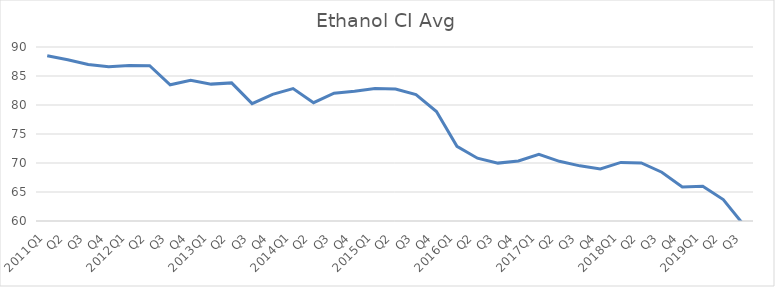
| Category | Series 0 |
|---|---|
| 2011Q1 | 88.48 |
| Q2 | 87.8 |
| Q3 | 87 |
| Q4 | 86.6 |
| 2012Q1 | 86.8 |
| Q2 | 86.78 |
| Q3 | 83.48 |
| Q4 | 84.27 |
| 2013Q1 | 83.6 |
| Q2 | 83.81 |
| Q3 | 80.24 |
| Q4 | 81.84 |
| 2014Q1 | 82.83 |
| Q2 | 80.4 |
| Q3 | 82.03 |
| Q4 | 82.38 |
| 2015Q1 | 82.86 |
| Q2 | 82.75 |
| Q3 | 81.8 |
| Q4 | 78.87 |
| 2016Q1 | 72.87 |
| Q2 | 70.83 |
| Q3 | 69.98 |
| Q4 | 70.34 |
| 2017Q1 | 71.49 |
| Q2 | 70.29 |
| Q3 | 69.51 |
| Q4 | 68.98 |
| 2018Q1 | 70.1 |
| Q2 | 70.02 |
| Q3 | 68.41 |
| Q4 | 65.88 |
| 2019Q1 | 66.01 |
| Q2 | 63.69 |
| Q3 | 59.33 |